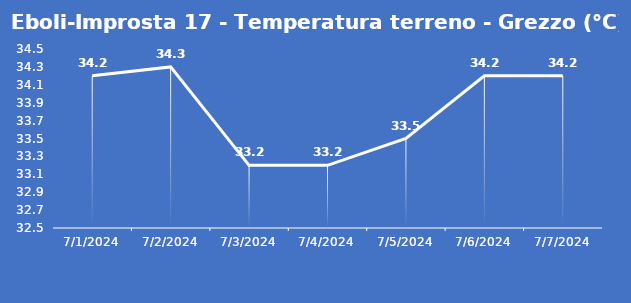
| Category | Eboli-Improsta 17 - Temperatura terreno - Grezzo (°C) |
|---|---|
| 7/1/24 | 34.2 |
| 7/2/24 | 34.3 |
| 7/3/24 | 33.2 |
| 7/4/24 | 33.2 |
| 7/5/24 | 33.5 |
| 7/6/24 | 34.2 |
| 7/7/24 | 34.2 |